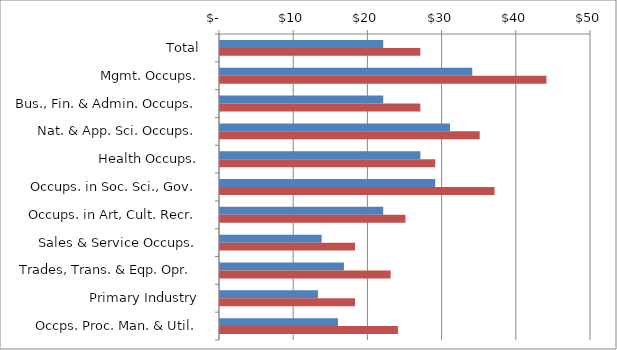
| Category | Series 0 | Series 1 |
|---|---|---|
| Total | 22 | 27 |
|  Mgmt. Occups.  | 34 | 44 |
|  Bus., Fin. & Admin. Occups.  | 22 | 27 |
|  Nat. & App. Sci. Occups.  | 31 | 35 |
|  Health Occups.  | 27 | 29 |
|  Occups. in Soc. Sci., Gov.  | 29 | 37 |
|  Occups. in Art, Cult. Recr.  | 22 | 25 |
|  Sales & Service Occups.  | 13.7 | 18.2 |
|  Trades, Trans. & Eqp. Opr.   | 16.7 | 23 |
|  Primary Industry  | 13.2 | 18.2 |
|  Occps. Proc. Man. & Util.  | 15.9 | 24 |